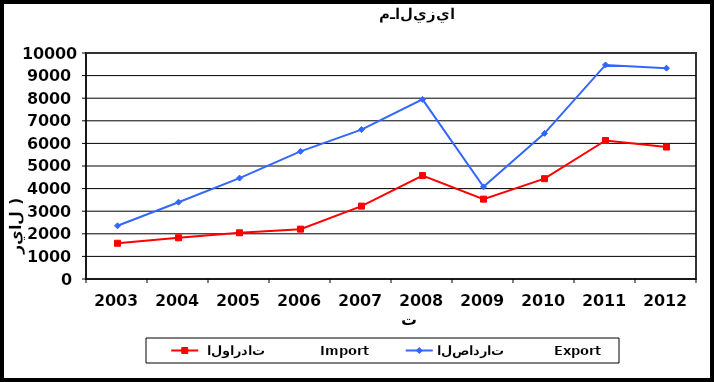
| Category |  الواردات           Import | الصادرات          Export |
|---|---|---|
| 2003.0 | 1582 | 2354 |
| 2004.0 | 1825 | 3398 |
| 2005.0 | 2045 | 4465 |
| 2006.0 | 2206 | 5649 |
| 2007.0 | 3225 | 6611 |
| 2008.0 | 4577 | 7948 |
| 2009.0 | 3534 | 4078 |
| 2010.0 | 4439 | 6444 |
| 2011.0 | 6129 | 9471 |
| 2012.0 | 5840 | 9328 |